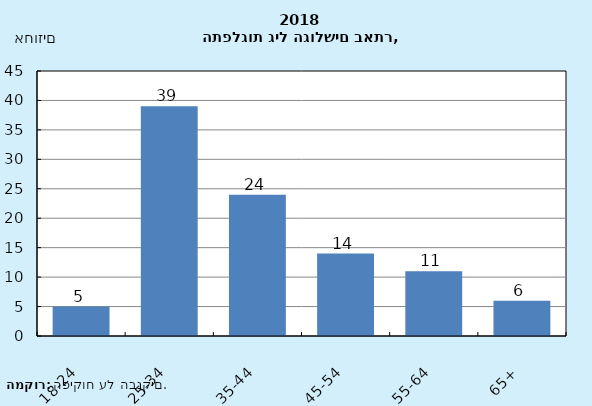
| Category | Series 0 |
|---|---|
| 18-24 | 5 |
| 25-34 | 39 |
| 35-44 | 24 |
| 45-54 | 14 |
| 55-64 | 11 |
| 65+ | 6 |